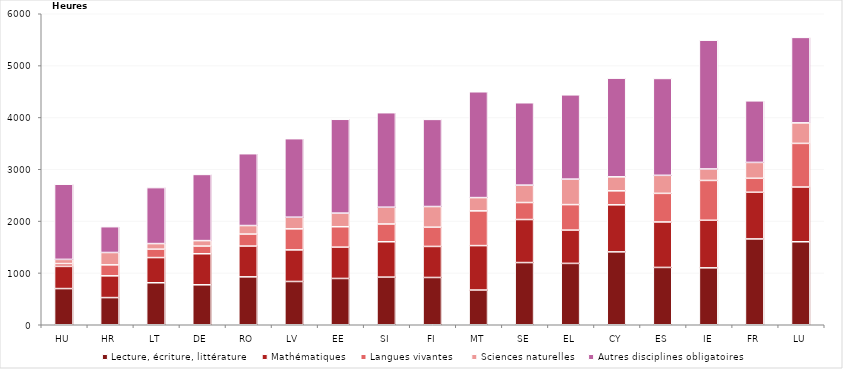
| Category | Lecture, écriture, littérature  | Mathématiques | Langues vivantes  | Sciences naturelles | Autres disciplines obligatoires |
|---|---|---|---|---|---|
| HU | 698 | 428 | 54 | 81 | 1450 |
| HR | 524 | 420 | 212 | 238 | 498 |
| LT | 810 | 486 | 162 | 108 | 1080 |
| DE | 771 | 599 | 148 | 105 | 1277 |
| RO | 924 | 594 | 231 | 165 | 1386 |
| LV | 835 | 609 | 406 | 225 | 1515 |
| EE | 893 | 604 | 394 | 263 | 1810 |
| SI | 919 | 682 | 343 | 324 | 1823 |
| FI | 912 | 599 | 371 | 399 | 1681 |
| MT | 670 | 857 | 670 | 256 | 2042 |
| SE | 1200 | 830 | 328 | 336 | 1589 |
| EL | 1184 | 642 | 492 | 492 | 1626 |
| CY | 1406 | 908 | 270 | 270 | 1904 |
| ES | 1106 | 877 | 552 | 348 | 1869 |
| IE | 1098 | 918 | 768 | 222 | 2484 |
| FR | 1656 | 900 | 270 | 306 | 1188 |
| LU | 1601 | 1056 | 842 | 396 | 1649 |